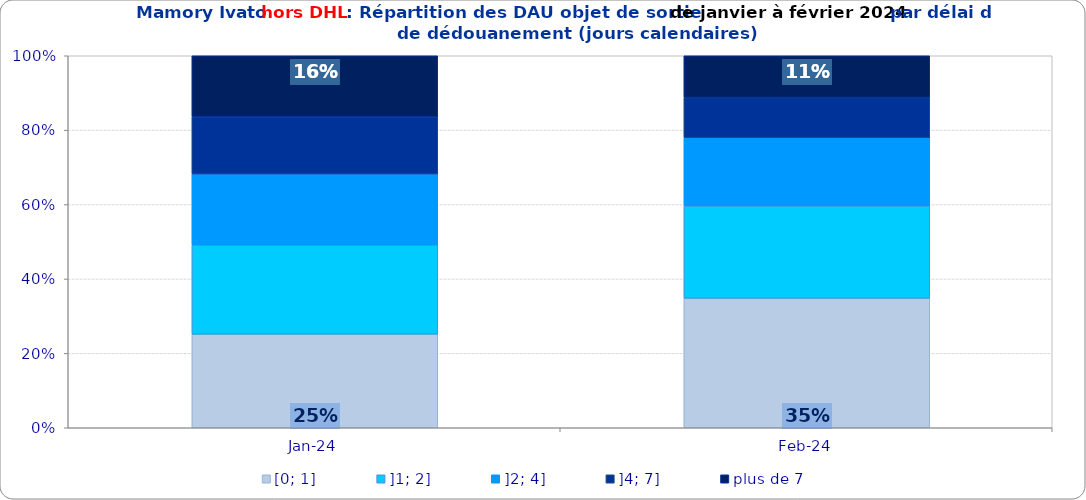
| Category | [0; 1] | ]1; 2] | ]2; 4] | ]4; 7] | plus de 7 |
|---|---|---|---|---|---|
| 2024-01-01 | 0.251 | 0.24 | 0.191 | 0.154 | 0.164 |
| 2024-02-01 | 0.348 | 0.249 | 0.183 | 0.108 | 0.112 |